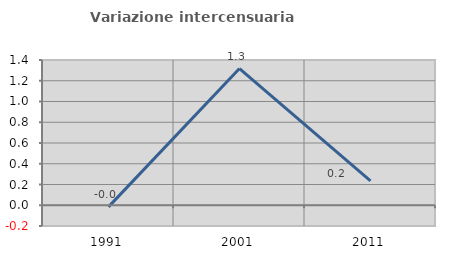
| Category | Variazione intercensuaria annua |
|---|---|
| 1991.0 | -0.016 |
| 2001.0 | 1.318 |
| 2011.0 | 0.236 |